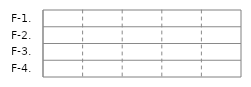
| Category | IN | OUT |
|---|---|---|
| F-1. | 0 | 0 |
| F-2. | 0 | 0 |
| F-3. | 0 | 0 |
| F-4. | 0 | 0 |